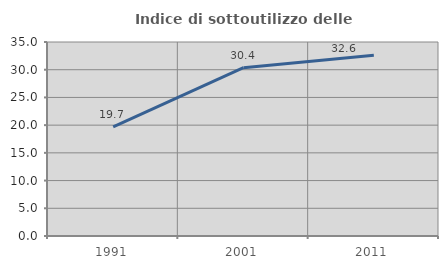
| Category | Indice di sottoutilizzo delle abitazioni  |
|---|---|
| 1991.0 | 19.695 |
| 2001.0 | 30.357 |
| 2011.0 | 32.593 |